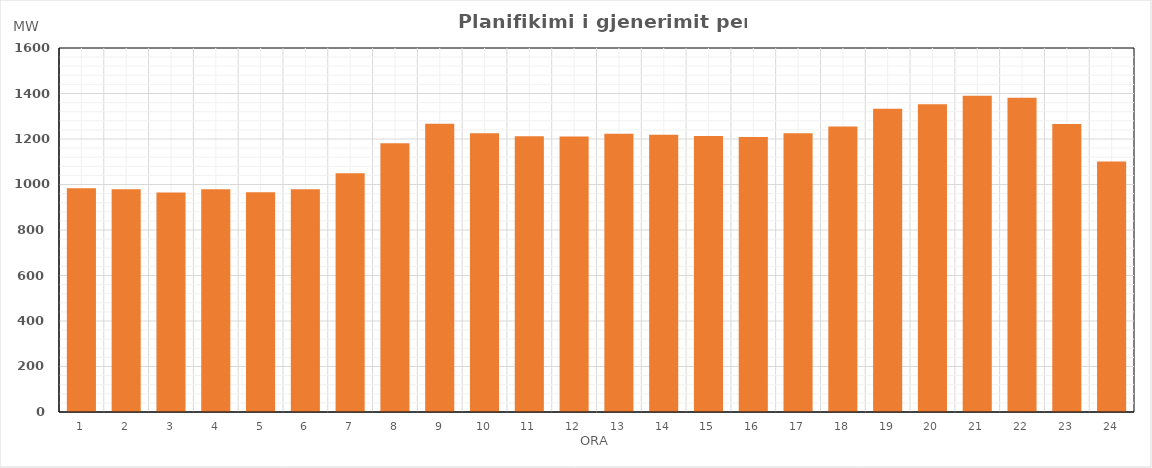
| Category | Max (MW) |
|---|---|
| 0 | 983.28 |
| 1 | 979.56 |
| 2 | 965.23 |
| 3 | 978.63 |
| 4 | 966.05 |
| 5 | 978.63 |
| 6 | 1049.1 |
| 7 | 1181.07 |
| 8 | 1267.12 |
| 9 | 1225.61 |
| 10 | 1212.31 |
| 11 | 1211.21 |
| 12 | 1223.13 |
| 13 | 1218.45 |
| 14 | 1212.68 |
| 15 | 1208.93 |
| 16 | 1224.82 |
| 17 | 1254.72 |
| 18 | 1332.45 |
| 19 | 1352.97 |
| 20 | 1390.03 |
| 21 | 1380.83 |
| 22 | 1265.87 |
| 23 | 1101.53 |